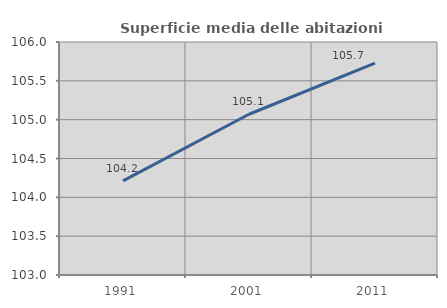
| Category | Superficie media delle abitazioni occupate |
|---|---|
| 1991.0 | 104.212 |
| 2001.0 | 105.07 |
| 2011.0 | 105.727 |